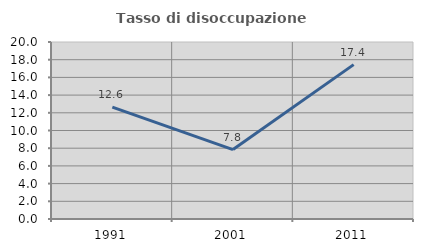
| Category | Tasso di disoccupazione giovanile  |
|---|---|
| 1991.0 | 12.644 |
| 2001.0 | 7.843 |
| 2011.0 | 17.442 |